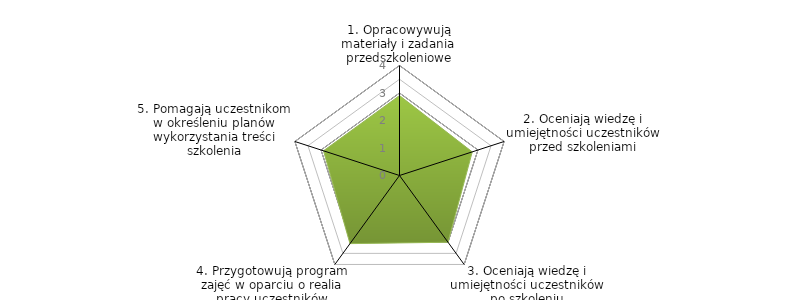
| Category | Series 0 | BENCHMARK |
|---|---|---|
| 1. Opracowywują materiały i zadania przedszkoleniowe |  | 2.906 |
| 2. Oceniają wiedzę i umiejętności uczestników przed szkoleniami |  | 2.781 |
| 3. Oceniają wiedzę i umiejętności uczestników po szkoleniu |  | 3 |
| 4. Przygotowują program zajęć w oparciu o realia pracy uczestników |  | 3.062 |
| 5. Pomagają uczestnikom w określeniu planów wykorzystania treści szkolenia |  | 2.906 |